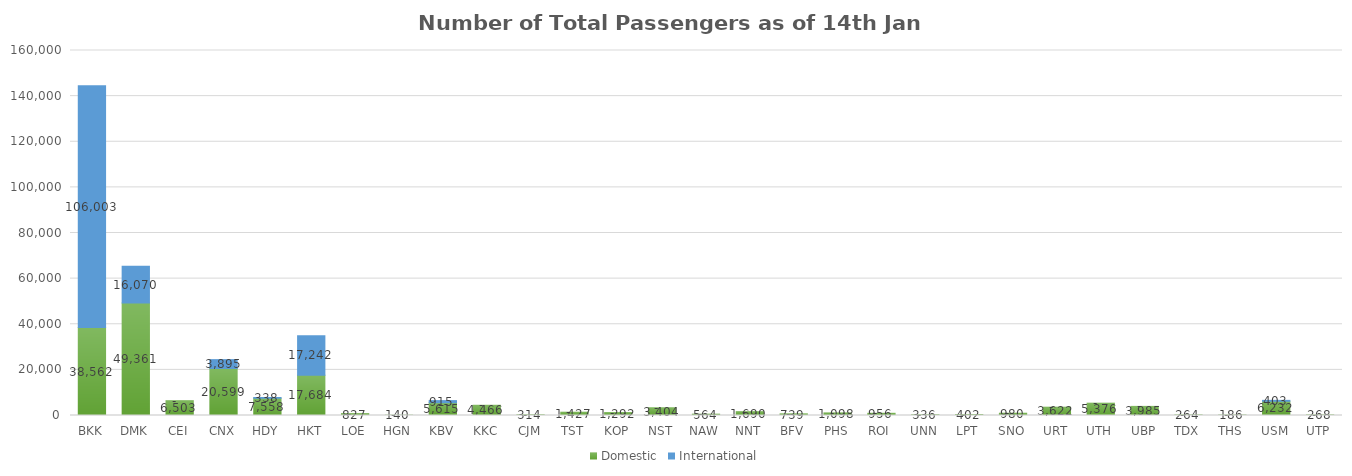
| Category | Domestic | International |
|---|---|---|
| BKK | 38562 | 106003 |
| DMK | 49361 | 16070 |
| CEI | 6503 | 0 |
| CNX | 20599 | 3895 |
| HDY | 7558 | 338 |
| HKT | 17684 | 17242 |
| LOE | 827 | 0 |
| HGN | 140 | 0 |
| KBV | 5615 | 915 |
| KKC | 4466 | 0 |
| CJM | 314 | 0 |
| TST | 1427 | 0 |
| KOP | 1292 | 0 |
| NST | 3404 | 0 |
| NAW | 564 | 0 |
| NNT | 1690 | 0 |
| BFV | 739 | 0 |
| PHS | 1098 | 0 |
| ROI | 956 | 0 |
| UNN | 336 | 0 |
| LPT | 402 | 0 |
| SNO | 980 | 0 |
| URT | 3622 | 0 |
| UTH | 5376 | 0 |
| UBP | 3985 | 0 |
| TDX | 264 | 0 |
| THS | 186 | 0 |
| USM | 6232 | 403 |
| UTP | 268 | 0 |